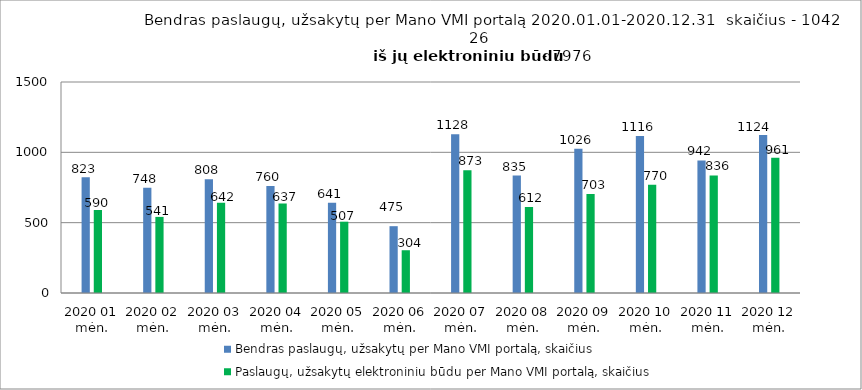
| Category | Bendras paslaugų, užsakytų per Mano VMI portalą, skaičius | Paslaugų, užsakytų elektroniniu būdu per Mano VMI portalą, skaičius |
|---|---|---|
| 2020 01 mėn. | 823 | 590 |
| 2020 02 mėn. | 748 | 541 |
| 2020 03 mėn. | 808 | 642 |
| 2020 04 mėn. | 760 | 637 |
| 2020 05 mėn. | 641 | 507 |
| 2020 06 mėn. | 475 | 304 |
| 2020 07 mėn. | 1128 | 873 |
| 2020 08 mėn. | 835 | 612 |
| 2020 09 mėn. | 1026 | 703 |
| 2020 10 mėn. | 1116 | 770 |
| 2020 11 mėn. | 942 | 836 |
| 2020 12 mėn. | 1124 | 961 |